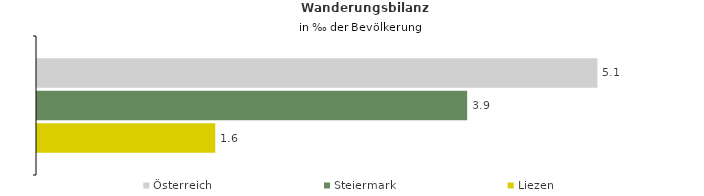
| Category | Österreich | Steiermark | Liezen |
|---|---|---|---|
| Wanderungsrate in ‰ der Bevölkerung, Periode 2016-2020 | 5.087 | 3.905 | 1.618 |